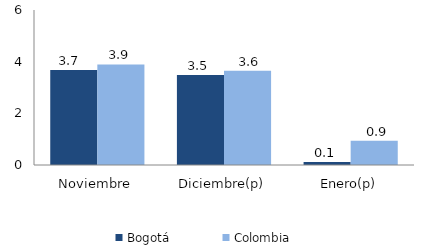
| Category | Bogotá | Colombia |
|---|---|---|
| Noviembre | 3.673 | 3.895 |
| Diciembre(p) | 3.486 | 3.645 |
| Enero(p) | 0.118 | 0.939 |